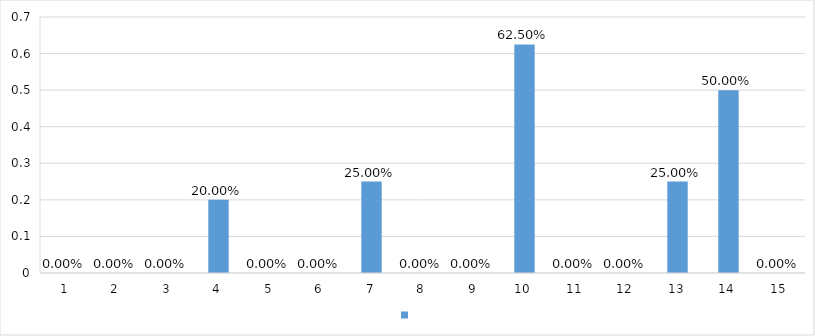
| Category | Series 0 |
|---|---|
| 1 | 0 |
| 2 | 0 |
| 3 | 0 |
| 4 | 0.2 |
| 5 | 0 |
| 6 | 0 |
| 7 | 0.25 |
| 8 | 0 |
| 9 | 0 |
| 10 | 0.625 |
| 11 | 0 |
| 12 | 0 |
| 13 | 0.25 |
| 14 | 0.5 |
| 15 | 0 |